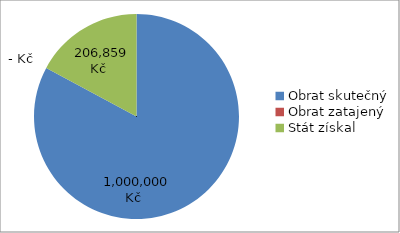
| Category | Series 1 | Series 0 |
|---|---|---|
| Obrat skutečný | 1000000 | 1000000 |
| Obrat zatajený | 0 | 0 |
| Stát získal | 206859.2 | 206859.2 |